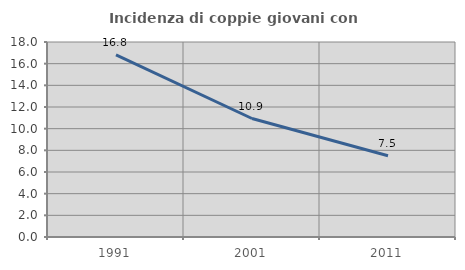
| Category | Incidenza di coppie giovani con figli |
|---|---|
| 1991.0 | 16.821 |
| 2001.0 | 10.938 |
| 2011.0 | 7.5 |